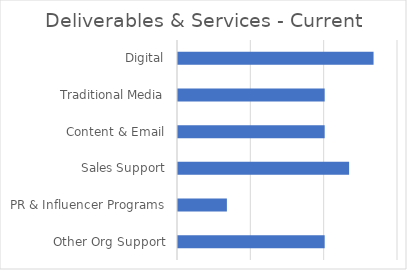
| Category | Current Scope |
|---|---|
| Other Org Support | 1 |
| PR & Influencer Programs | 0.333 |
| Sales Support | 1.167 |
| Content & Email | 1 |
| Traditional Media | 1 |
| Digital | 1.333 |